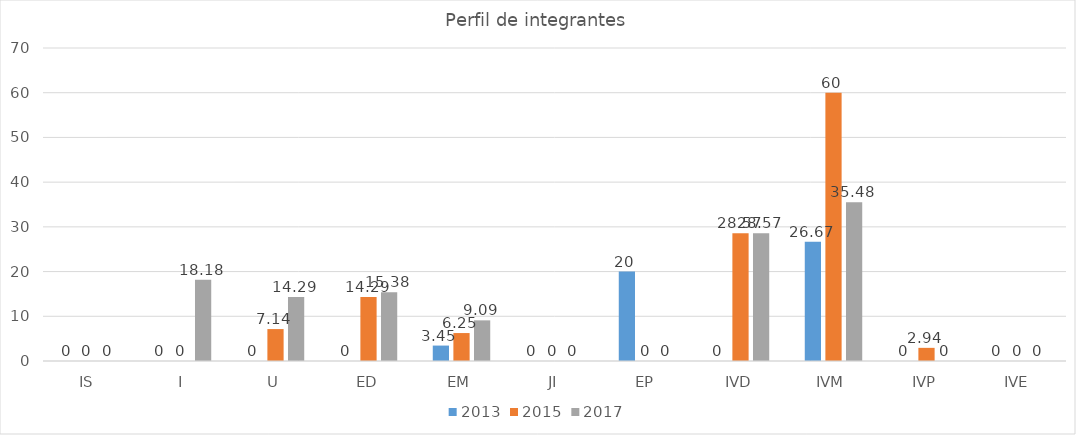
| Category | 2013 | 2015 | 2017 |
|---|---|---|---|
| IS | 0 | 0 | 0 |
| I | 0 | 0 | 18.18 |
| U | 0 | 7.14 | 14.29 |
| ED | 0 | 14.29 | 15.38 |
| EM | 3.45 | 6.25 | 9.09 |
| JI | 0 | 0 | 0 |
| EP | 20 | 0 | 0 |
| IVD | 0 | 28.57 | 28.57 |
| IVM | 26.67 | 60 | 35.48 |
| IVP | 0 | 2.94 | 0 |
| IVE | 0 | 0 | 0 |